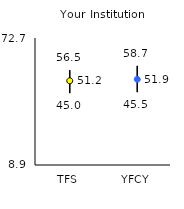
| Category | 25th | 75th | Mean |
|---|---|---|---|
| TFS | 45 | 56.5 | 51.19 |
| YFCY | 45.5 | 58.7 | 51.94 |